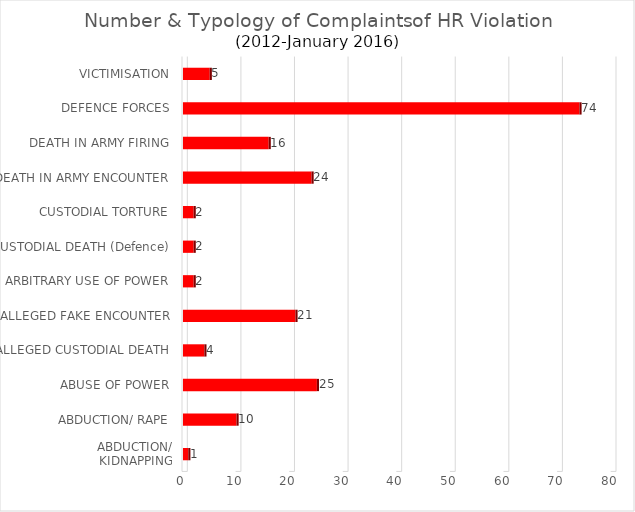
| Category | Cases |
|---|---|
| ABDUCTION/
KIDNAPPING | 1 |
| ABDUCTION/ RAPE | 10 |
| ABUSE OF POWER | 25 |
| ALLEGED CUSTODIAL DEATH | 4 |
| ALLEGED FAKE ENCOUNTER | 21 |
| ARBITRARY USE OF POWER | 2 |
| CUSTODIAL DEATH (Defence) | 2 |
| CUSTODIAL TORTURE | 2 |
| DEATH IN ARMY ENCOUNTER | 24 |
| DEATH IN ARMY FIRING | 16 |
| DEFENCE FORCES | 74 |
| VICTIMISATION | 5 |